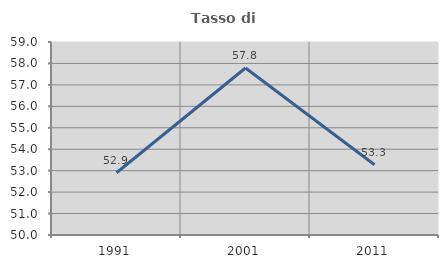
| Category | Tasso di occupazione   |
|---|---|
| 1991.0 | 52.903 |
| 2001.0 | 57.789 |
| 2011.0 | 53.274 |